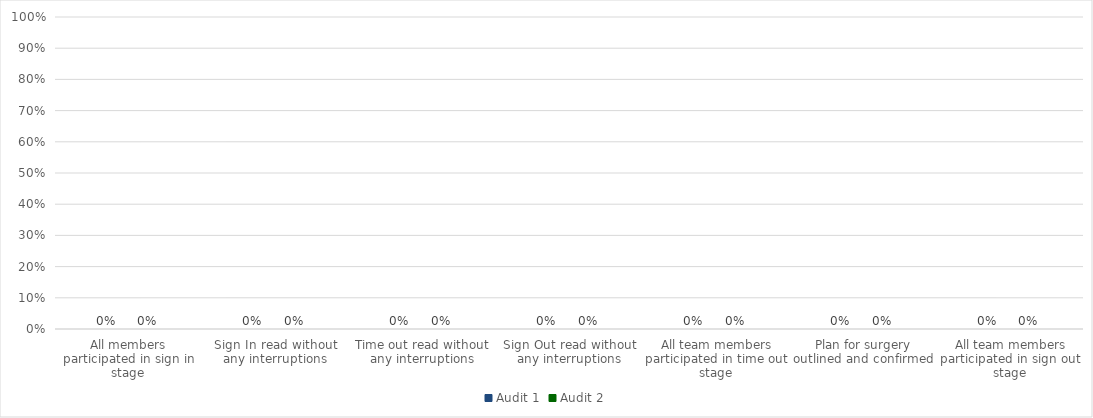
| Category | Audit 1 | Audit 2 |
|---|---|---|
| All members participated in sign in stage | 0 | 0 |
| Sign In read without any interruptions | 0 | 0 |
| Time out read without any interruptions | 0 | 0 |
| Sign Out read without any interruptions | 0 | 0 |
| All team members participated in time out stage | 0 | 0 |
| Plan for surgery outlined and confirmed | 0 | 0 |
| All team members participated in sign out stage | 0 | 0 |